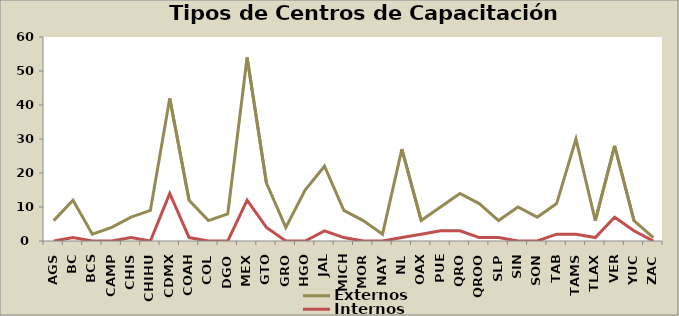
| Category | Externos | Internos |
|---|---|---|
| AGS | 6 | 0 |
| BC | 12 | 1 |
| BCS | 2 | 0 |
| CAMP | 4 | 0 |
| CHIS | 7 | 1 |
| CHIHU | 9 | 0 |
| CDMX | 42 | 14 |
| COAH | 12 | 1 |
| COL | 6 | 0 |
| DGO | 8 | 0 |
| MEX | 54 | 12 |
| GTO | 17 | 4 |
| GRO | 4 | 0 |
| HGO | 15 | 0 |
| JAL | 22 | 3 |
| MICH | 9 | 1 |
| MOR | 6 | 0 |
| NAY | 2 | 0 |
| NL | 27 | 1 |
| OAX | 6 | 2 |
| PUE | 10 | 3 |
| QRO | 14 | 3 |
| QROO | 11 | 1 |
| SLP | 6 | 1 |
| SIN | 10 | 0 |
| SON | 7 | 0 |
| TAB | 11 | 2 |
| TAMS | 30 | 2 |
| TLAX | 6 | 1 |
| VER | 28 | 7 |
| YUC | 6 | 3 |
| ZAC | 1 | 0 |